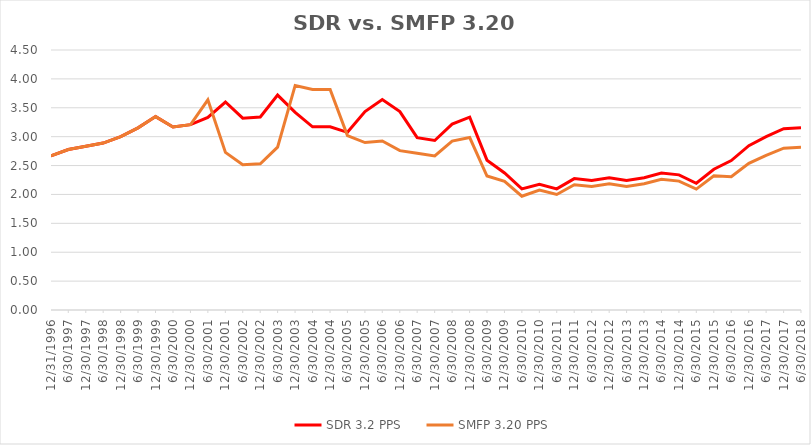
| Category | SDR 3.2 PPS | SMFP 3.20 PPS |
|---|---|---|
| 12/31/96 | 2.667 | 2.667 |
| 6/30/97 | 2.778 | 2.778 |
| 12/31/97 | 2.833 | 2.833 |
| 6/30/98 | 2.889 | 2.889 |
| 12/31/98 | 3 | 3 |
| 6/30/99 | 3.153 | 3.153 |
| 12/31/99 | 3.347 | 3.347 |
| 6/30/00 | 3.167 | 3.167 |
| 12/31/00 | 3.208 | 3.208 |
| 6/30/01 | 3.333 | 3.636 |
| 12/31/01 | 3.6 | 2.727 |
| 6/30/02 | 3.32 | 2.515 |
| 12/31/02 | 3.34 | 2.53 |
| 6/30/03 | 3.72 | 2.818 |
| 12/31/03 | 3.42 | 3.886 |
| 6/30/04 | 3.17 | 3.818 |
| 12/31/04 | 3.17 | 3.818 |
| 6/30/05 | 3.075 | 3.019 |
| 12/31/05 | 3.434 | 2.897 |
| 6/30/06 | 3.642 | 2.924 |
| 12/31/06 | 3.434 | 2.758 |
| 6/30/07 | 2.983 | 2.712 |
| 12/31/07 | 2.933 | 2.667 |
| 6/30/08 | 3.217 | 2.924 |
| 12/31/08 | 3.339 | 2.985 |
| 6/30/09 | 2.593 | 2.318 |
| 12/31/09 | 2.371 | 2.227 |
| 6/30/10 | 2.097 | 1.97 |
| 12/31/10 | 2.177 | 2.077 |
| 6/30/11 | 2.097 | 2 |
| 12/31/11 | 2.274 | 2.169 |
| 6/30/12 | 2.242 | 2.138 |
| 12/31/12 | 2.29 | 2.185 |
| 6/30/13 | 2.242 | 2.138 |
| 12/31/13 | 2.29 | 2.185 |
| 6/30/14 | 2.371 | 2.262 |
| 12/31/14 | 2.339 | 2.231 |
| 6/30/15 | 2.194 | 2.092 |
| 12/31/15 | 2.435 | 2.323 |
| 6/30/16 | 2.586 | 2.308 |
| 12/31/16 | 2.845 | 2.538 |
| 6/30/17 | 3 | 2.677 |
| 12/31/17 | 3.138 | 2.8 |
| 6/30/18 | 3.155 | 2.815 |